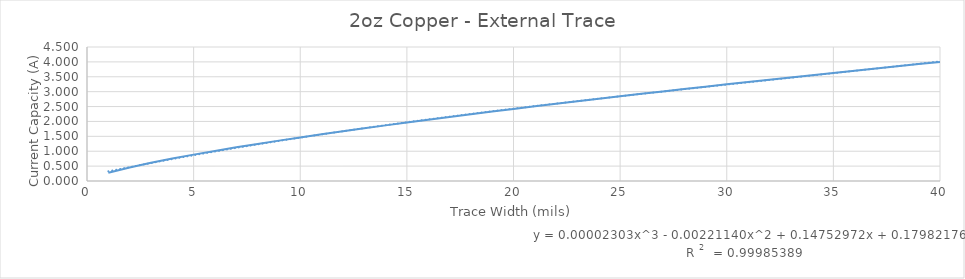
| Category | Series 0 |
|---|---|
| 0 | 0.276 |
| 1 | 0.456 |
| 2 | 0.611 |
| 3 | 0.753 |
| 4 | 0.886 |
| 5 | 1.011 |
| 6 | 1.13 |
| 7 | 1.245 |
| 8 | 1.356 |
| 9 | 1.464 |
| 10 | 1.568 |
| 11 | 1.671 |
| 12 | 1.77 |
| 13 | 1.868 |
| 14 | 1.964 |
| 15 | 2.058 |
| 16 | 2.15 |
| 17 | 2.241 |
| 18 | 2.331 |
| 19 | 2.419 |
| 20 | 2.506 |
| 21 | 2.592 |
| 22 | 2.677 |
| 23 | 2.761 |
| 24 | 2.844 |
| 25 | 2.926 |
| 26 | 3.007 |
| 27 | 3.088 |
| 28 | 3.167 |
| 29 | 3.246 |
| 30 | 3.324 |
| 31 | 3.402 |
| 32 | 3.478 |
| 33 | 3.554 |
| 34 | 3.63 |
| 35 | 3.705 |
| 36 | 3.779 |
| 37 | 3.853 |
| 38 | 3.926 |
| 39 | 3.999 |